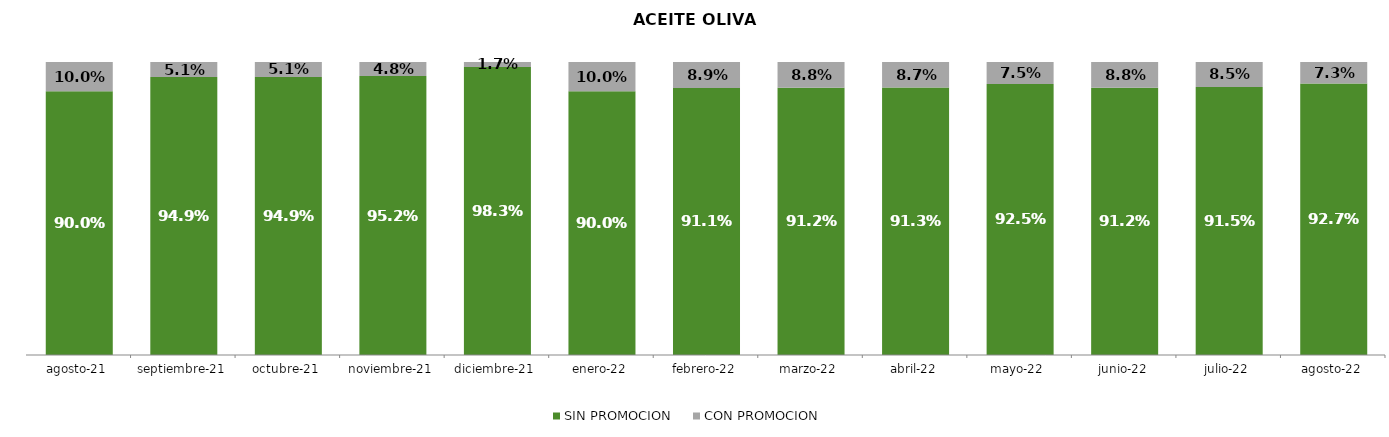
| Category | SIN PROMOCION   | CON PROMOCION   |
|---|---|---|
| 2021-08-01 | 0.9 | 0.1 |
| 2021-09-01 | 0.949 | 0.051 |
| 2021-10-01 | 0.949 | 0.051 |
| 2021-11-01 | 0.952 | 0.048 |
| 2021-12-01 | 0.983 | 0.017 |
| 2022-01-01 | 0.9 | 0.1 |
| 2022-02-01 | 0.911 | 0.089 |
| 2022-03-01 | 0.912 | 0.088 |
| 2022-04-01 | 0.913 | 0.087 |
| 2022-05-01 | 0.925 | 0.075 |
| 2022-06-01 | 0.912 | 0.088 |
| 2022-07-01 | 0.915 | 0.085 |
| 2022-08-01 | 0.927 | 0.073 |